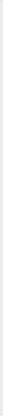
| Category | Goal 2020 = greater than % | Results 2020 |
|---|---|---|
| e.g. BS Finance | 0.4 | 0.47 |
| e.g. BS Management | 0.4 | 0.38 |
| e.g. MBA  | 0.9 | 0.95 |